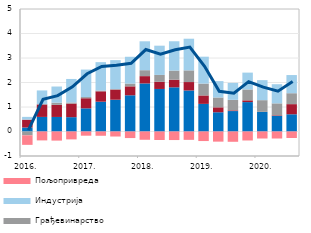
| Category | Остале делатности | Трговина | Грађевинарство | Индустрија | Пољопривреда |
|---|---|---|---|---|---|
| 2016. | 0.163 | 0.321 | -0.156 | 0.113 | -0.39 |
| II | 0.595 | 0.508 | 0.015 | 0.558 | -0.363 |
| III | 0.594 | 0.494 | 0.088 | 0.66 | -0.372 |
| IV | 0.585 | 0.553 | 0.046 | 0.96 | -0.322 |
| 2017. | 0.945 | 0.413 | 0.049 | 1.121 | -0.172 |
| II | 1.216 | 0.424 | 0.032 | 1.158 | -0.174 |
| III | 1.297 | 0.414 | 0.02 | 1.182 | -0.205 |
| IV | 1.478 | 0.366 | 0.113 | 1.094 | -0.268 |
| 2018. | 1.962 | 0.298 | 0.242 | 1.18 | -0.338 |
| II | 1.736 | 0.292 | 0.281 | 1.193 | -0.346 |
| III | 1.803 | 0.311 | 0.372 | 1.197 | -0.349 |
| IV | 1.675 | 0.344 | 0.476 | 1.292 | -0.341 |
| 2019. | 1.127 | 0.345 | 0.485 | 1.097 | -0.39 |
| II | 0.785 | 0.202 | 0.402 | 0.668 | -0.414 |
| III | 0.834 | 0.029 | 0.43 | 0.69 | -0.42 |
| IV | 1.2 | 0.072 | 0.444 | 0.687 | -0.366 |
| 2020. | 0.799 | 0.004 | 0.477 | 0.817 | -0.286 |
| II | 0.64 | 0.023 | 0.486 | 0.781 | -0.286 |
| III | 0.703 | 0.414 | 0.446 | 0.741 | -0.267 |